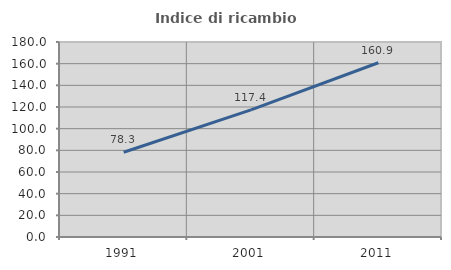
| Category | Indice di ricambio occupazionale  |
|---|---|
| 1991.0 | 78.261 |
| 2001.0 | 117.391 |
| 2011.0 | 160.87 |